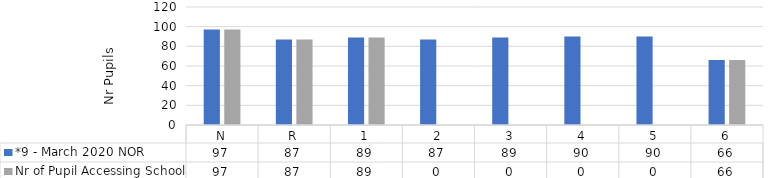
| Category | *9 - March 2020 NOR | Nr of Pupil Accessing School |
|---|---|---|
| N | 97 | 97 |
| R | 87 | 87 |
| 1 | 89 | 89 |
| 2 | 87 | 0 |
| 3 | 89 | 0 |
| 4 | 90 | 0 |
| 5 | 90 | 0 |
| 6 | 66 | 66 |